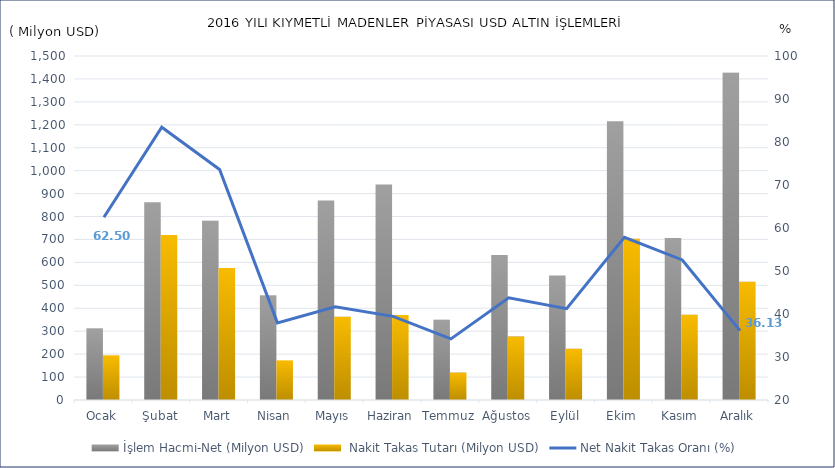
| Category | İşlem Hacmi-Net (Milyon USD) |  Nakit Takas Tutarı (Milyon USD) |
|---|---|---|
| Ocak | 311.594 | 194.759 |
| Şubat | 862.817 | 719.962 |
| Mart | 781.204 | 575.087 |
| Nisan | 455.638 | 172.887 |
| Mayıs | 870.256 | 362.61 |
| Haziran | 939.985 | 370.898 |
| Temmuz | 349.405 | 119.546 |
| Ağustos | 632.126 | 276.717 |
| Eylül | 543.055 | 223.91 |
| Ekim | 1215.949 | 703.237 |
| Kasım | 706.58 | 371.414 |
| Aralık | 1426.896 | 515.573 |